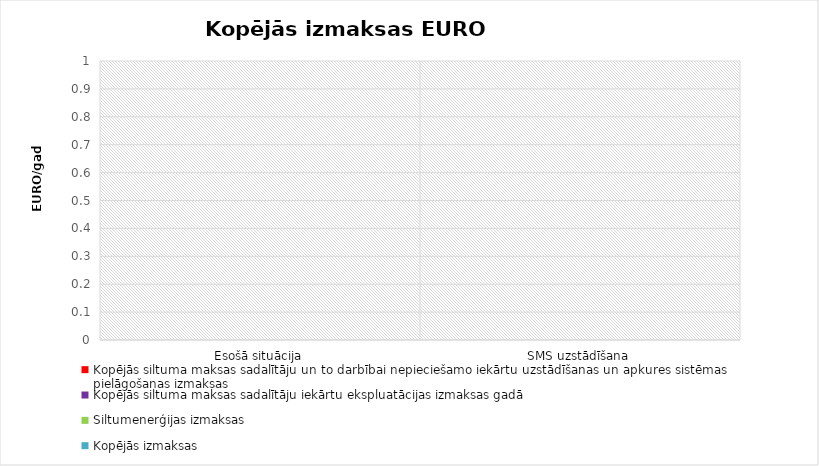
| Category | Kopējās siltuma maksas sadalītāju un to darbībai nepieciešamo iekārtu uzstādīšanas un apkures sistēmas pielāgošanas izmaksas  | Kopējās siltuma maksas sadalītāju iekārtu ekspluatācijas izmaksas gadā | Siltumenerģijas izmaksas | Kopējās izmaksas |
|---|---|---|---|---|
| Esošā situācija | 0 | 0 | 0 | 0 |
| SMS uzstādīšana | 0 | 0 | 0 | 0 |